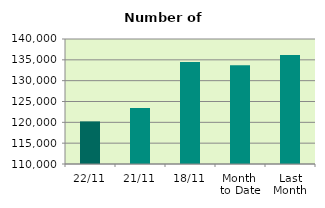
| Category | Series 0 |
|---|---|
| 22/11 | 120228 |
| 21/11 | 123412 |
| 18/11 | 134510 |
| Month 
to Date | 133689.25 |
| Last
Month | 136171.238 |